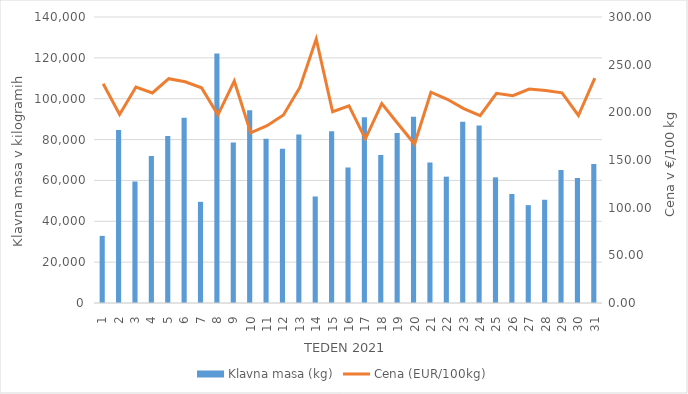
| Category | Klavna masa (kg) |
|---|---|
| 1.0 | 32871 |
| 2.0 | 84639 |
| 3.0 | 59476 |
| 4.0 | 72013 |
| 5.0 | 81759 |
| 6.0 | 90669 |
| 7.0 | 49517 |
| 8.0 | 122111 |
| 9.0 | 78545 |
| 10.0 | 94384 |
| 11.0 | 80405 |
| 12.0 | 75534 |
| 13.0 | 82440 |
| 14.0 | 52143 |
| 15.0 | 84105 |
| 16.0 | 66298 |
| 17.0 | 90925 |
| 18.0 | 72394 |
| 19.0 | 83193 |
| 20.0 | 91231 |
| 21.0 | 68763 |
| 22.0 | 61837 |
| 23.0 | 88747 |
| 24.0 | 86888 |
| 25.0 | 61507 |
| 26.0 | 53379 |
| 27.0 | 47910 |
| 28.0 | 50529 |
| 29.0 | 65062 |
| 30.0 | 61178 |
| 31.0 | 67992 |